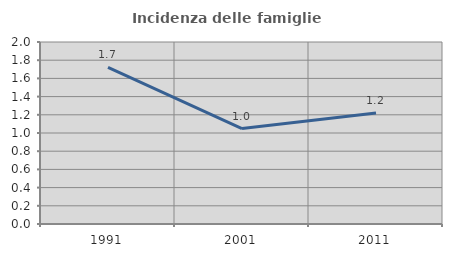
| Category | Incidenza delle famiglie numerose |
|---|---|
| 1991.0 | 1.721 |
| 2001.0 | 1.049 |
| 2011.0 | 1.22 |